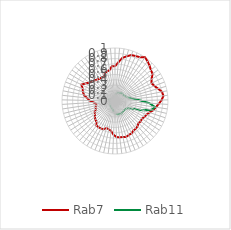
| Category | Rab7 | Rab11 |
|---|---|---|
| 0.0 | 0.653 | 0.108 |
| 0.10913 | 0.732 | 0.125 |
| 0.21825 | 0.826 | 0.143 |
| 0.32738 | 0.873 | 0.167 |
| 0.43651 | 0.922 | 0.162 |
| 0.54563 | 0.934 | 0.158 |
| 0.65476 | 0.951 | 0.169 |
| 0.76389 | 1 | 0.178 |
| 0.87302 | 0.967 | 0.186 |
| 0.98214 | 0.933 | 0.196 |
| 1.09127 | 0.894 | 0.205 |
| 1.2004 | 0.872 | 0.191 |
| 1.30952 | 0.805 | 0.186 |
| 1.41865 | 0.767 | 0.214 |
| 1.52778 | 0.796 | 0.224 |
| 1.6369 | 0.846 | 0.243 |
| 1.74603 | 0.902 | 0.296 |
| 1.85516 | 0.92 | 0.366 |
| 1.96429 | 0.88 | 0.477 |
| 2.07341 | 0.829 | 0.652 |
| 2.18254 | 0.779 | 0.764 |
| 2.29167 | 0.742 | 0.709 |
| 2.40079 | 0.683 | 0.549 |
| 2.50992 | 0.647 | 0.372 |
| 2.61905 | 0.634 | 0.29 |
| 2.72817 | 0.607 | 0.255 |
| 2.8373 | 0.621 | 0.25 |
| 2.94643 | 0.61 | 0.245 |
| 3.05556 | 0.637 | 0.246 |
| 3.16468 | 0.654 | 0.252 |
| 3.27381 | 0.656 | 0.259 |
| 3.38294 | 0.687 | 0.265 |
| 3.49206 | 0.691 | 0.262 |
| 3.60119 | 0.711 | 0.254 |
| 3.71032 | 0.694 | 0.259 |
| 3.81944 | 0.693 | 0.249 |
| 3.92857 | 0.68 | 0.242 |
| 4.0377 | 0.639 | 0.22 |
| 4.14683 | 0.571 | 0.196 |
| 4.25595 | 0.548 | 0.171 |
| 4.36508 | 0.533 | 0.157 |
| 4.47421 | 0.575 | 0.156 |
| 4.58333 | 0.581 | 0.138 |
| 4.69246 | 0.583 | 0.138 |
| 4.80159 | 0.579 | 0.13 |
| 4.91071 | 0.527 | 0.127 |
| 5.01984 | 0.511 | 0.12 |
| 5.12897 | 0.48 | 0.114 |
| 5.2381 | 0.452 | 0.113 |
| 5.34722 | 0.438 | 0.1 |
| 5.45635 | 0.392 | 0.102 |
| 5.56548 | 0.388 | 0.109 |
| 5.6746 | 0.366 | 0.087 |
| 5.78373 | 0.358 | 0.076 |
| 5.89286 | 0.405 | 0.082 |
| 6.00198 | 0.481 | 0.099 |
| 6.11111 | 0.532 | 0.108 |
| 6.22024 | 0.597 | 0.111 |
| 6.32937 | 0.631 | 0.093 |
| 6.43849 | 0.652 | 0.086 |
| 6.54762 | 0.706 | 0.092 |
| 6.65675 | 0.647 | 0.082 |
| 6.76587 | 0.593 | 0.074 |
| 6.875 | 0.564 | 0.074 |
| 6.98413 | 0.547 | 0.069 |
| 7.09325 | 0.527 | 0.062 |
| 7.20238 | 0.505 | 0.051 |
| 7.31151 | 0.513 | 0.06 |
| 7.42063 | 0.492 | 0.054 |
| 7.52976 | 0.563 | 0.055 |
| 7.63889 | 0.575 | 0.061 |
| 7.74802 | 0.594 | 0.093 |
| 7.85714 | 0.663 | 0.108 |